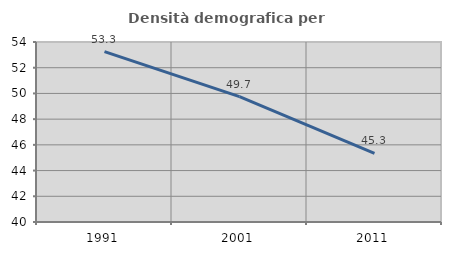
| Category | Densità demografica |
|---|---|
| 1991.0 | 53.257 |
| 2001.0 | 49.749 |
| 2011.0 | 45.337 |